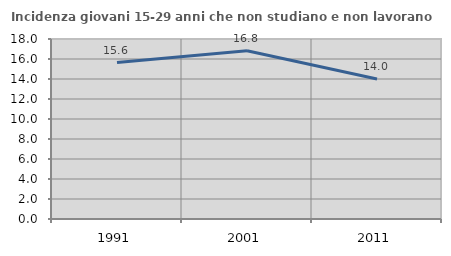
| Category | Incidenza giovani 15-29 anni che non studiano e non lavorano  |
|---|---|
| 1991.0 | 15.643 |
| 2001.0 | 16.822 |
| 2011.0 | 14 |